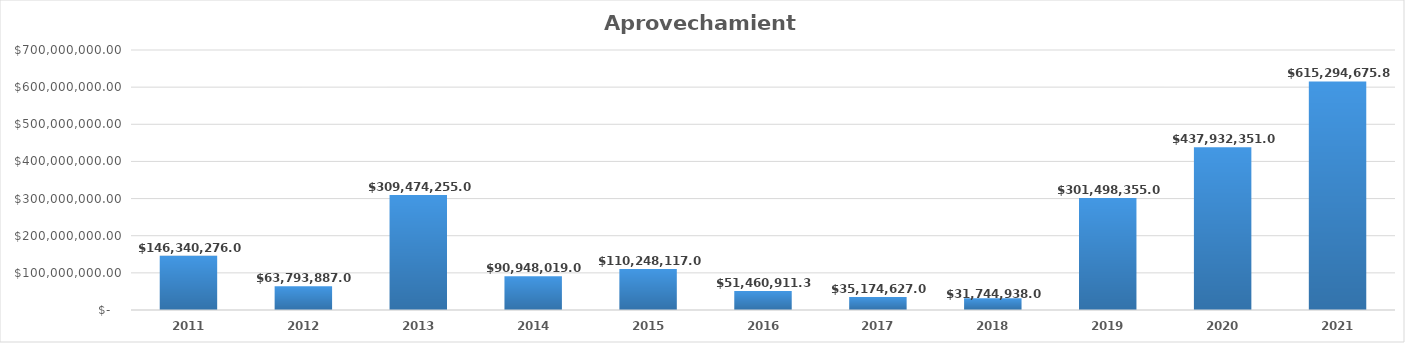
| Category | Aprovechamientos |
|---|---|
| 2011.0 | 146340276 |
| 2012.0 | 63793887 |
| 2013.0 | 309474255 |
| 2014.0 | 90948019 |
| 2015.0 | 110248117 |
| 2016.0 | 51460911.31 |
| 2017.0 | 35174627 |
| 2018.0 | 31744938 |
| 2019.0 | 301498355 |
| 2020.0 | 437932351 |
| 2021.0 | 615294675.83 |